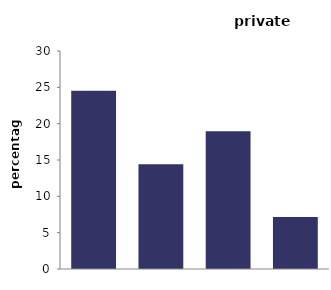
| Category | private rented |
|---|---|
| non decent | 24.535 |
| HHSRS | 14.43 |
| serious 
disrepair | 18.954 |
| dampness | 7.16 |